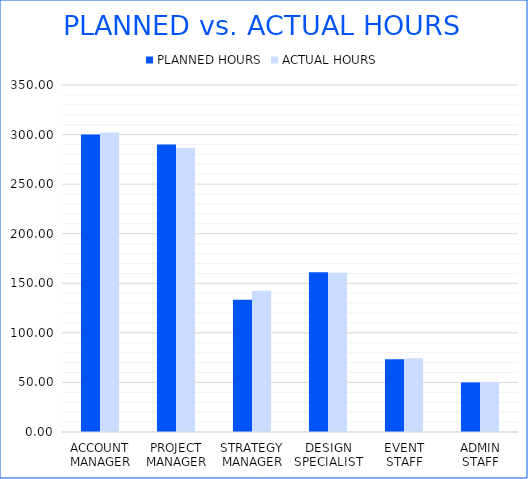
| Category | PLANNED HOURS | ACTUAL HOURS |
|---|---|---|
| ACCOUNT MANAGER | 300 | 302 |
| PROJECT MANAGER | 290 | 286.333 |
| STRATEGY MANAGER | 133.333 | 142.5 |
| DESIGN SPECIALIST | 161.111 | 160.556 |
| EVENT STAFF | 73.333 | 74.444 |
| ADMIN STAFF | 50 | 50.333 |